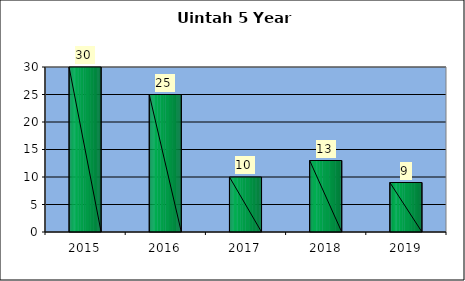
| Category | Washington Terrace March 5 Year Comparison |
|---|---|
| 0 | 30 |
| 1 | 25 |
| 2 | 10 |
| 3 | 13 |
| 4 | 9 |